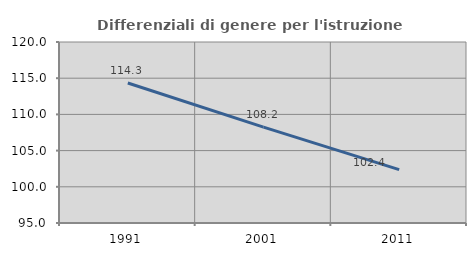
| Category | Differenziali di genere per l'istruzione superiore |
|---|---|
| 1991.0 | 114.336 |
| 2001.0 | 108.24 |
| 2011.0 | 102.365 |